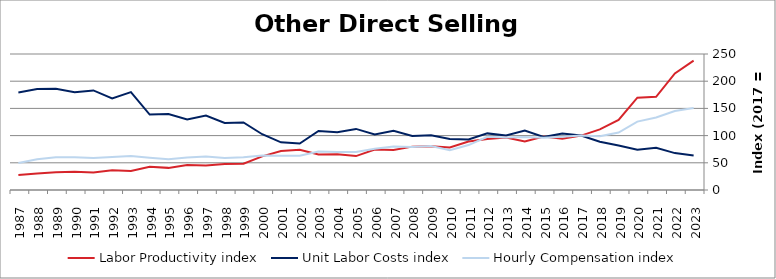
| Category | Labor Productivity index | Unit Labor Costs index | Hourly Compensation index |
|---|---|---|---|
| 2023.0 | 237.944 | 63.358 | 150.756 |
| 2022.0 | 214.311 | 67.804 | 145.311 |
| 2021.0 | 171.4 | 77.793 | 133.337 |
| 2020.0 | 169.617 | 74.107 | 125.698 |
| 2019.0 | 128.907 | 81.914 | 105.593 |
| 2018.0 | 111.369 | 88.646 | 98.724 |
| 2017.0 | 100 | 100 | 100 |
| 2016.0 | 94.161 | 104.018 | 97.945 |
| 2015.0 | 98.391 | 97.43 | 95.862 |
| 2014.0 | 89.083 | 109.374 | 97.434 |
| 2013.0 | 96.622 | 100.072 | 96.691 |
| 2012.0 | 93.947 | 104.071 | 97.772 |
| 2011.0 | 88.966 | 92.866 | 82.619 |
| 2010.0 | 78.184 | 93.562 | 73.15 |
| 2009.0 | 80.409 | 100.448 | 80.77 |
| 2008.0 | 79.714 | 99.29 | 79.148 |
| 2007.0 | 73.559 | 108.961 | 80.15 |
| 2006.0 | 74.394 | 102.153 | 75.995 |
| 2005.0 | 62.354 | 112.3 | 70.024 |
| 2004.0 | 65.921 | 106.284 | 70.064 |
| 2003.0 | 65.313 | 108.452 | 70.833 |
| 2002.0 | 73.811 | 85.464 | 63.082 |
| 2001.0 | 71.766 | 87.566 | 62.843 |
| 2000.0 | 61.864 | 102.506 | 63.415 |
| 1999.0 | 48.403 | 124.257 | 60.145 |
| 1998.0 | 47.643 | 123.128 | 58.662 |
| 1997.0 | 44.94 | 136.94 | 61.541 |
| 1996.0 | 46.109 | 129.732 | 59.819 |
| 1995.0 | 40.677 | 139.507 | 56.747 |
| 1994.0 | 42.788 | 138.685 | 59.34 |
| 1993.0 | 34.849 | 179.861 | 62.679 |
| 1992.0 | 36.153 | 168.417 | 60.888 |
| 1991.0 | 32.158 | 183.083 | 58.876 |
| 1990.0 | 33.432 | 179.602 | 60.045 |
| 1989.0 | 32.409 | 185.906 | 60.25 |
| 1988.0 | 30.382 | 185.693 | 56.417 |
| 1987.0 | 27.646 | 179.324 | 49.575 |